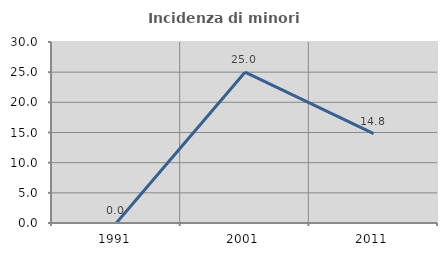
| Category | Incidenza di minori stranieri |
|---|---|
| 1991.0 | 0 |
| 2001.0 | 25 |
| 2011.0 | 14.815 |